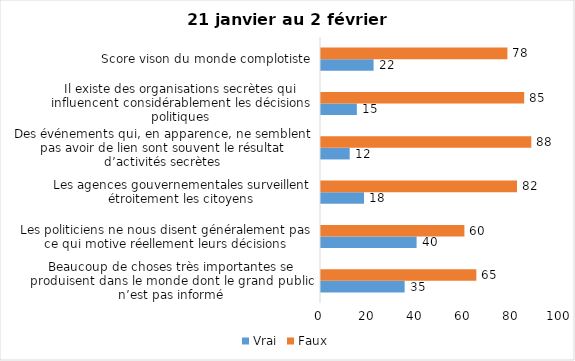
| Category | Vrai | Faux |
|---|---|---|
| Beaucoup de choses très importantes se produisent dans le monde dont le grand public n’est pas informé | 35 | 65 |
| Les politiciens ne nous disent généralement pas ce qui motive réellement leurs décisions | 40 | 60 |
| Les agences gouvernementales surveillent étroitement les citoyens | 18 | 82 |
| Des événements qui, en apparence, ne semblent pas avoir de lien sont souvent le résultat d’activités secrètes | 12 | 88 |
| Il existe des organisations secrètes qui influencent considérablement les décisions politiques | 15 | 85 |
| Score vison du monde complotiste | 22 | 78 |